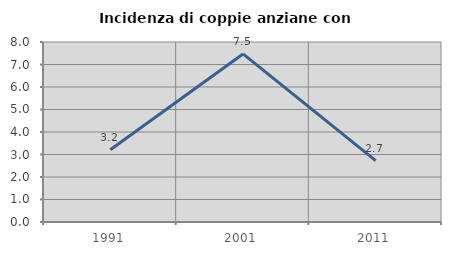
| Category | Incidenza di coppie anziane con figli |
|---|---|
| 1991.0 | 3.214 |
| 2001.0 | 7.469 |
| 2011.0 | 2.727 |